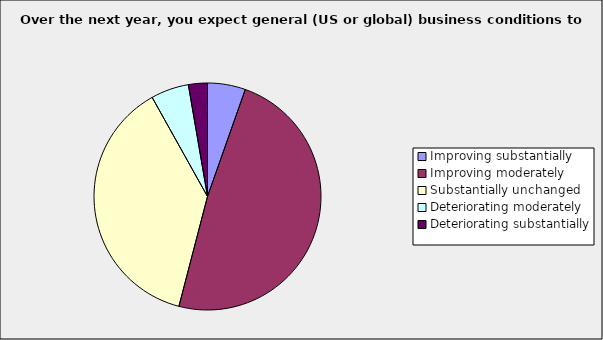
| Category | Series 0 |
|---|---|
| Improving substantially | 0.054 |
| Improving moderately | 0.486 |
| Substantially unchanged | 0.378 |
| Deteriorating moderately | 0.054 |
| Deteriorating substantially | 0.027 |